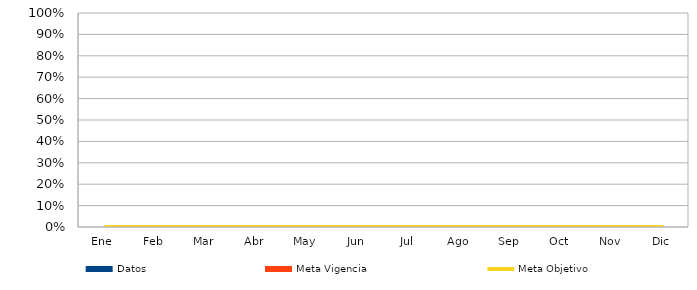
| Category | Datos | Meta Vigencia |
|---|---|---|
| Ene | 0 | 0 |
| Feb | 0 | 0 |
| Mar | 0 | 0 |
| Abr | 0 | 0 |
| May | 0 | 0 |
| Jun | 0 | 0 |
| Jul | 0 | 0 |
| Ago | 0 | 0 |
| Sep | 0 | 0 |
| Oct | 0 | 0 |
| Nov | 0 | 0 |
| Dic | 0 | 0 |